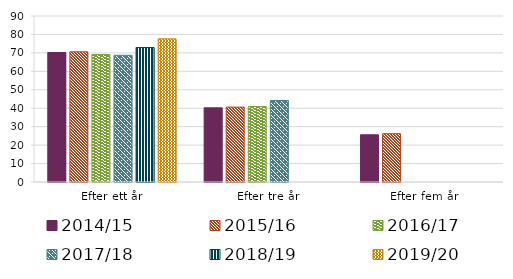
| Category | 2014/15 | 2015/16 | 2016/17 | 2017/18 | 2018/19 | 2019/20 |
|---|---|---|---|---|---|---|
| Efter ett år | 70.2 | 70.6 | 69.1 | 68.7 | 72.9 | 77.6 |
| Efter tre år | 40.2 | 40.6 | 40.9 | 44.2 | 0 | 0 |
| Efter fem år | 25.6 | 26.2 | 0 | 0 | 0 | 0 |